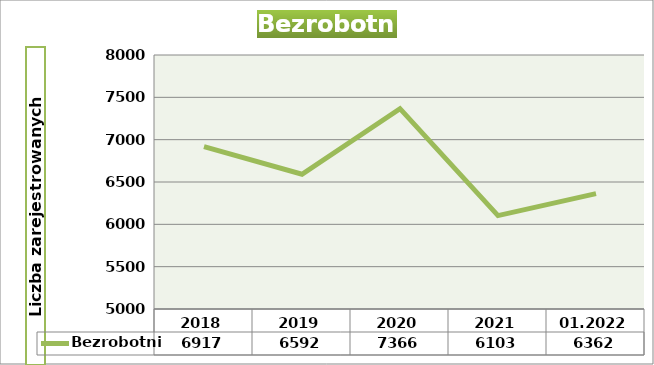
| Category | Bezrobotni |
|---|---|
| 2018 | 6917 |
| 2019 | 6592 |
| 2020 | 7366 |
| 2021 | 6103 |
| 01.2022 | 6362 |